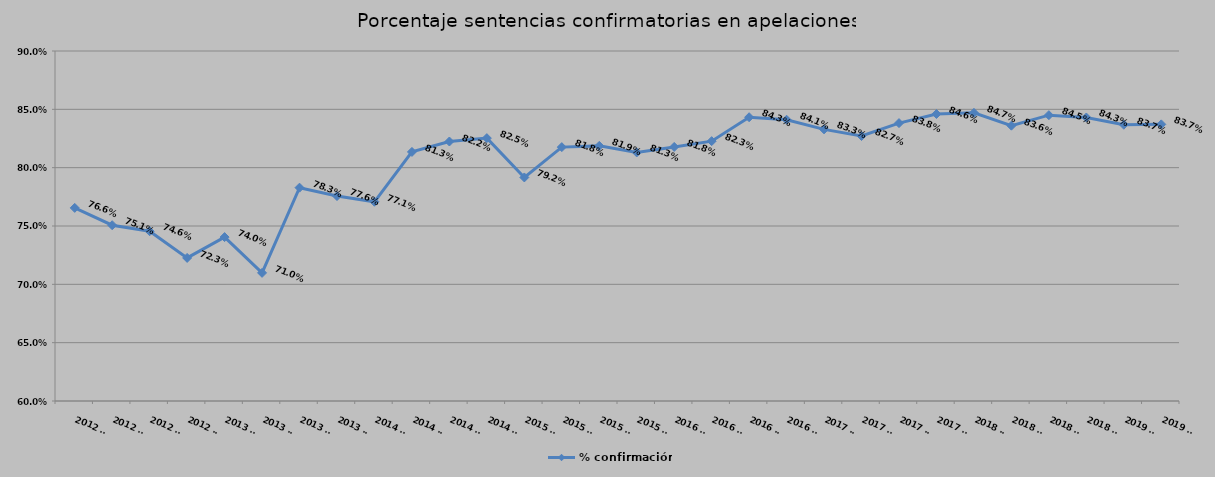
| Category | % confirmación |
|---|---|
| 2012 T1 | 0.766 |
| 2012 T2 | 0.751 |
| 2012 T3 | 0.746 |
| 2012 T4 | 0.723 |
| 2013 T1 | 0.74 |
| 2013 T2 | 0.71 |
| 2013 T3 | 0.783 |
| 2013 T4 | 0.776 |
| 2014 T1 | 0.771 |
| 2014 T2 | 0.813 |
| 2014 T3 | 0.822 |
| 2014 T4 | 0.825 |
| 2015 T1 | 0.792 |
| 2015 T2 | 0.818 |
| 2015 T3 | 0.819 |
| 2015 T4 | 0.813 |
| 2016 T1 | 0.818 |
| 2016 T2 | 0.823 |
| 2016 T3 | 0.843 |
| 2016 T4 | 0.841 |
| 2017 T1 | 0.833 |
| 2017 T2 | 0.827 |
| 2017 T3 | 0.838 |
| 2017 T4 | 0.846 |
| 2018 T1 | 0.847 |
| 2018 T2 | 0.836 |
| 2018 T3 | 0.845 |
| 2018 T4 | 0.843 |
| 2019 T1 | 0.837 |
| 2019 T2 | 0.837 |